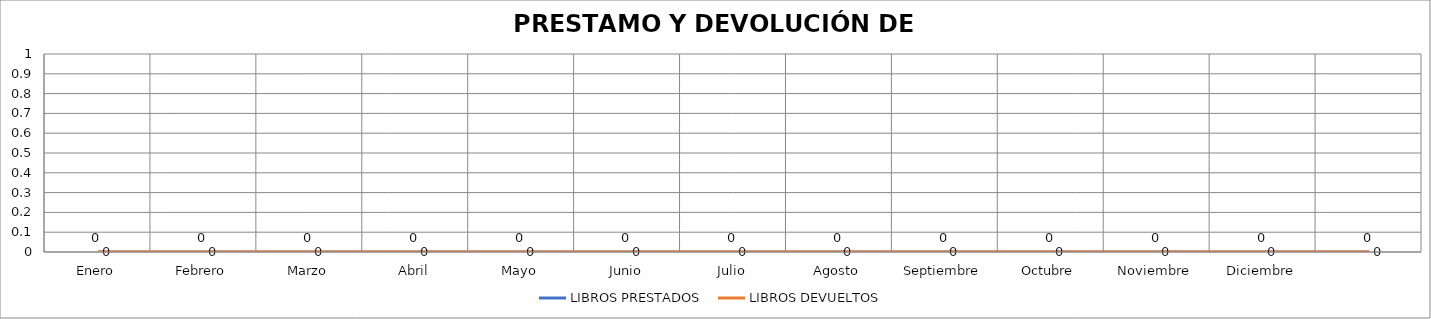
| Category | LIBROS PRESTADOS | LIBROS DEVUELTOS |
|---|---|---|
| Enero | 0 | 0 |
| Febrero | 0 | 0 |
| Marzo | 0 | 0 |
| Abril | 0 | 0 |
| Mayo | 0 | 0 |
| Junio | 0 | 0 |
| Julio | 0 | 0 |
| Agosto | 0 | 0 |
| Septiembre | 0 | 0 |
| Octubre | 0 | 0 |
| Noviembre | 0 | 0 |
| Diciembre | 0 | 0 |